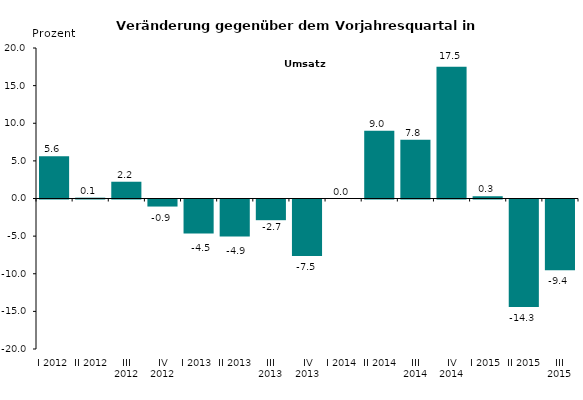
| Category | Series 0 |
|---|---|
| I 2012 | 5.603 |
| II 2012 | 0.11 |
| III 2012 | 2.228 |
| IV 2012 | -0.936 |
| I 2013 | -4.513 |
| II 2013 | -4.922 |
| III 2013 | -2.749 |
| IV 2013 | -7.5 |
| I 2014 | 0 |
| II 2014 | 9 |
| III 2014 | 7.8 |
| IV 2014 | 17.5 |
| I 2015 | 0.3 |
| II 2015 | -14.3 |
| III 2015 | -9.4 |